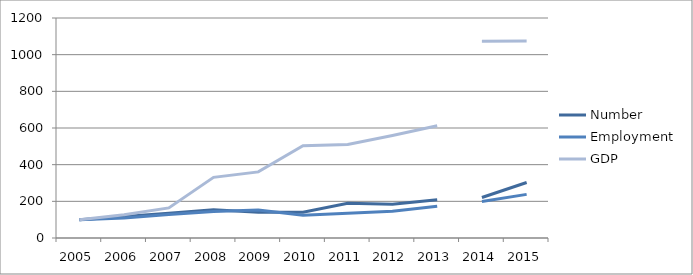
| Category | Number | Employment | GDP |
|---|---|---|---|
| 2005.0 | 100 | 100 | 100 |
| 2006.0 | 116.733 | 108.93 | 126.655 |
| 2007.0 | 135.293 | 128.312 | 164.108 |
| 2008.0 | 153.642 | 145.02 | 330.905 |
| 2009.0 | 140.753 | 152.961 | 360.536 |
| 2010.0 | 140.213 | 124.306 | 503.24 |
| 2011.0 | 189.255 | 135.044 | 509.577 |
| 2012.0 | 184.052 | 145.451 | 559.571 |
| 2013.0 | 208.241 | 173.311 | 612.23 |
| 2014.0 | 220.941 | 198.742 | 1073.416 |
| 2015.0 | 302.929 | 237.979 | 1074.351 |